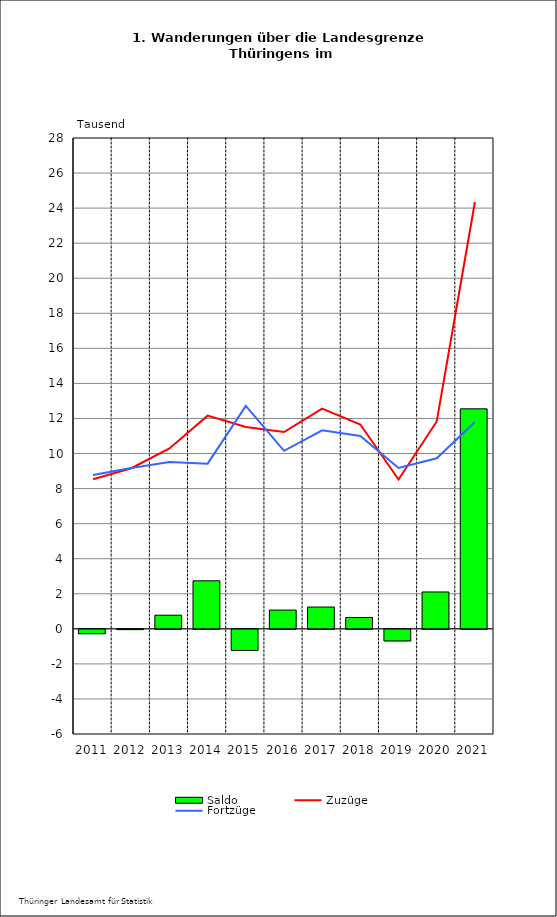
| Category | Saldo |
|---|---|
| 2011.0 | -0.249 |
| 2012.0 | -0.016 |
| 2013.0 | 0.777 |
| 2014.0 | 2.738 |
| 2015.0 | -1.207 |
| 2016.0 | 1.069 |
| 2017.0 | 1.243 |
| 2018.0 | 0.647 |
| 2019.0 | -0.662 |
| 2020.0 | 2.102 |
| 2021.0 | 12.55 |